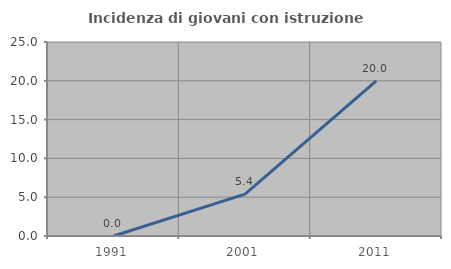
| Category | Incidenza di giovani con istruzione universitaria |
|---|---|
| 1991.0 | 0 |
| 2001.0 | 5.405 |
| 2011.0 | 20 |